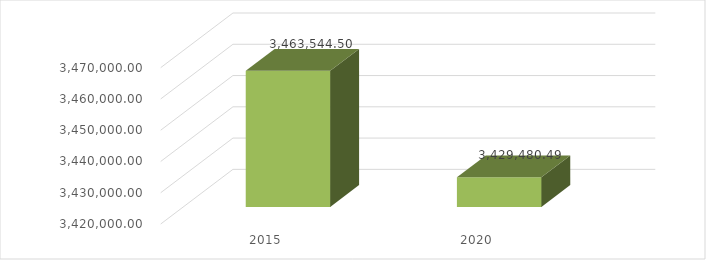
| Category | Series 0 |
|---|---|
| 2015.0 | 3463544.5 |
| 2020.0 | 3429480.486 |